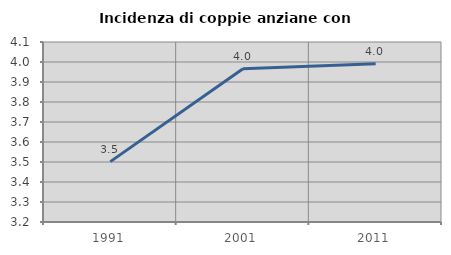
| Category | Incidenza di coppie anziane con figli |
|---|---|
| 1991.0 | 3.502 |
| 2001.0 | 3.967 |
| 2011.0 | 3.992 |